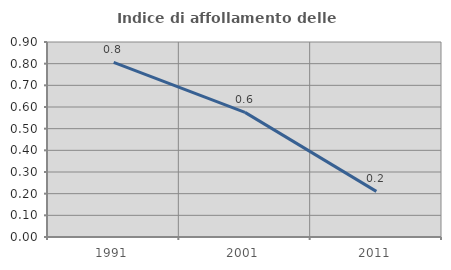
| Category | Indice di affollamento delle abitazioni  |
|---|---|
| 1991.0 | 0.806 |
| 2001.0 | 0.575 |
| 2011.0 | 0.211 |